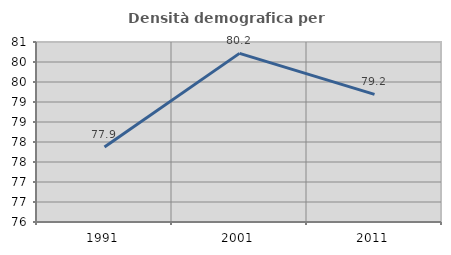
| Category | Densità demografica |
|---|---|
| 1991.0 | 77.875 |
| 2001.0 | 80.216 |
| 2011.0 | 79.191 |